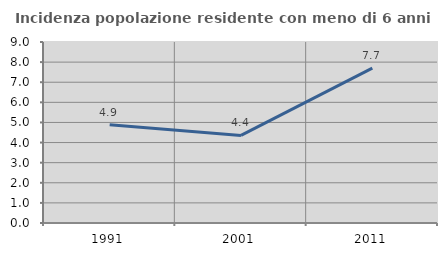
| Category | Incidenza popolazione residente con meno di 6 anni |
|---|---|
| 1991.0 | 4.883 |
| 2001.0 | 4.354 |
| 2011.0 | 7.7 |